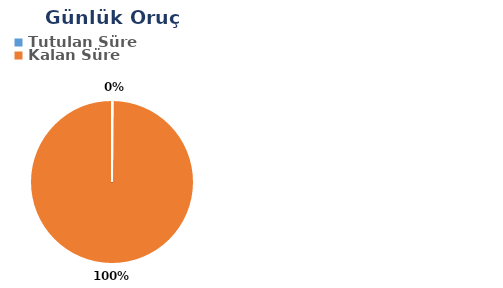
| Category | Günlük |
|---|---|
| Tutulan Süre | -0.001 |
| Kalan Süre | 0.575 |